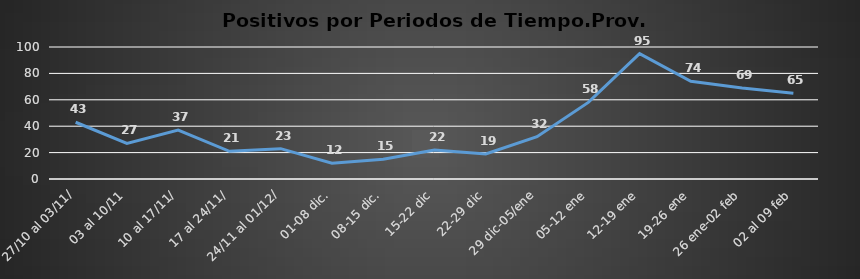
| Category | Prov. Condesuy |
|---|---|
| 27/10 al 03/11/ | 43 |
| 03 al 10/11 | 27 |
| 10 al 17/11/ | 37 |
|  17 al 24/11/ | 21 |
|  24/11 al 01/12/ | 23 |
| 01-08 dic. | 12 |
| 08-15 dic. | 15 |
| 15-22 dic | 22 |
| 22-29 dic | 19 |
| 29 dic-05/ene | 32 |
| 05-12 ene | 58 |
| 12-19 ene | 95 |
| 19-26 ene | 74 |
| 26 ene-02 feb | 69 |
| 02 al 09 feb | 65 |